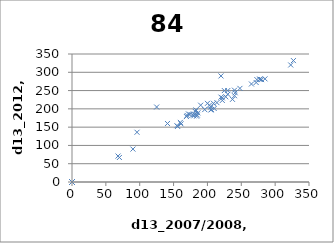
| Category | Series 0 |
|---|---|
| 0.0 | 0 |
| 214.0 | 217 |
| 206.0 | 198 |
| 183.0 | 197 |
| 0.0 | 0 |
| 0.0 | 0 |
| 225.0 | 250 |
| 205.0 | 205 |
| 172.0 | 186 |
| 0.0 | 0 |
| 190.0 | 210 |
| 141.0 | 160 |
| 0.0 | 0 |
| 205.0 | 197 |
| 161.0 | 159 |
| 196.0 | 198 |
| 160.0 | 163 |
| 0.0 | 0 |
| 0.0 | 0 |
| 278.0 | 281 |
| 0.0 | 0 |
| 210.0 | 201 |
| 90.0 | 90 |
| 220.0 | 232 |
| 96.0 | 136 |
| 0.0 | 0 |
| 125.0 | 205 |
| 0.0 | 0 |
| 273.0 | 280 |
| 185.0 | 183 |
| 0.0 | 0 |
| 230.0 | 250 |
| 0.0 | 0 |
| 0.0 | 0 |
| 0.0 | 0 |
| 240.0 | 251 |
| 200.0 | 215 |
| 186.0 | 189 |
| 0.0 | 0 |
| 0.0 | 0 |
| 155.0 | 154 |
| 277.0 | 281 |
| 184.0 | 180 |
| 248.0 | 256 |
| 0.0 | 0 |
| 170.0 | 182 |
| 222.0 | 230 |
| 0.0 | 0 |
| 227.0 | 233 |
| 0.0 | 0 |
| 0.0 | 0 |
| 0.0 | 0 |
| 182.0 | 193 |
| 0.0 | 0 |
| 180.0 | 181 |
| 0.0 | 0 |
| 0.0 | 0 |
| 0.0 | 0 |
| 0.0 | 0 |
| 156.0 | 152 |
| 0.0 | 0 |
| 0.0 | 0 |
| 181.0 | 185 |
| 0.0 | 0 |
| 280.0 | 280 |
| 222.0 | 223 |
| 178.0 | 183 |
| 323.0 | 320 |
| 0.0 | 0 |
| 0.0 | 0 |
| 237.0 | 226 |
| 169.0 | 179 |
| 0.0 | 0 |
| 327.0 | 332 |
| 0.0 | 0 |
| 0.0 | 0 |
| 0.0 | 0 |
| 203.0 | 210 |
| 285.0 | 282 |
| 0.0 | 0 |
| 265.0 | 268 |
| 272.0 | 272 |
| 240.0 | 236 |
| 220.0 | 290 |
| 230.0 | 240 |
| 0.0 | 0 |
| 174.0 | 185 |
| 209.0 | 215 |
| 241.0 | 244 |
| 0.0 | 0 |
| 70.0 | 67 |
| 0.0 | 0 |
| 0.0 | 0 |
| 68.0 | 71 |
| 0.0 | 0 |
| 0.0 | 0 |
| 0.0 | 0 |
| 0.0 | 0 |
| 0.0 | 0 |
| 0.0 | 0 |
| 0.0 | 0 |
| 0.0 | 0 |
| 0.0 | 0 |
| 0.0 | 0 |
| 0.0 | 0 |
| 0.0 | 0 |
| 0.0 | 0 |
| 0.0 | 0 |
| 0.0 | 0 |
| 0.0 | 0 |
| 0.0 | 0 |
| 0.0 | 0 |
| 0.0 | 0 |
| 0.0 | 0 |
| 0.0 | 0 |
| 0.0 | 0 |
| 0.0 | 0 |
| 0.0 | 0 |
| 0.0 | 0 |
| 0.0 | 0 |
| 0.0 | 0 |
| 0.0 | 0 |